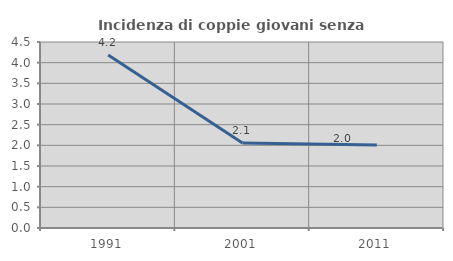
| Category | Incidenza di coppie giovani senza figli |
|---|---|
| 1991.0 | 4.187 |
| 2001.0 | 2.059 |
| 2011.0 | 2.008 |